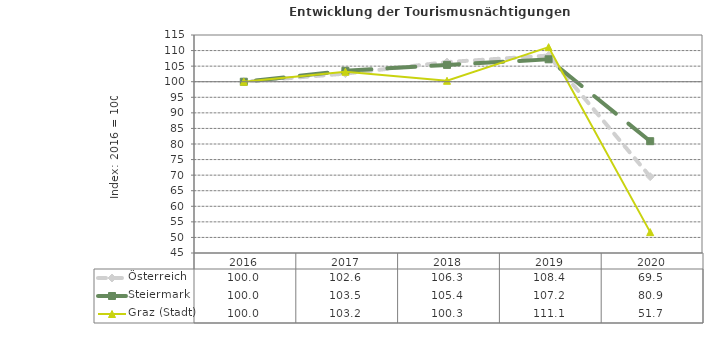
| Category | Österreich | Steiermark | Graz (Stadt) |
|---|---|---|---|
| 2020.0 | 69.5 | 80.9 | 51.7 |
| 2019.0 | 108.4 | 107.2 | 111.1 |
| 2018.0 | 106.3 | 105.4 | 100.3 |
| 2017.0 | 102.6 | 103.5 | 103.2 |
| 2016.0 | 100 | 100 | 100 |